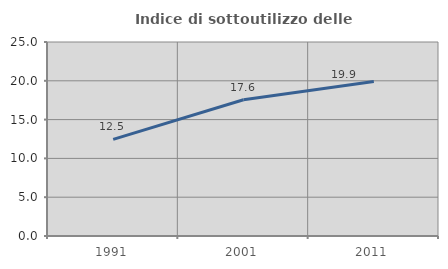
| Category | Indice di sottoutilizzo delle abitazioni  |
|---|---|
| 1991.0 | 12.454 |
| 2001.0 | 17.565 |
| 2011.0 | 19.9 |